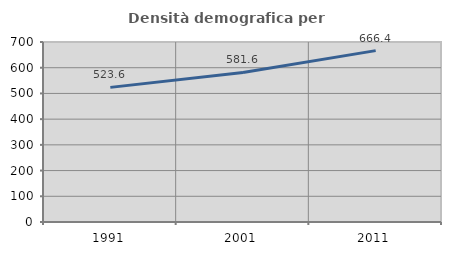
| Category | Densità demografica |
|---|---|
| 1991.0 | 523.55 |
| 2001.0 | 581.592 |
| 2011.0 | 666.444 |